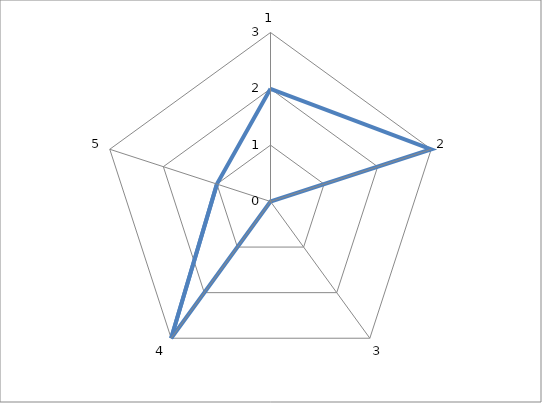
| Category | Series 0 |
|---|---|
| 0 | 2 |
| 1 | 3 |
| 2 | 0 |
| 3 | 3 |
| 4 | 1 |